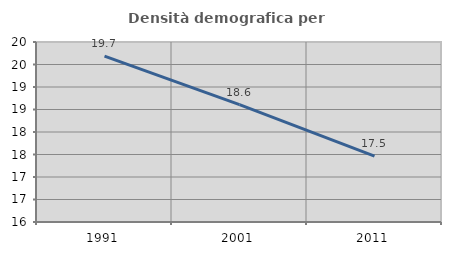
| Category | Densità demografica |
|---|---|
| 1991.0 | 19.684 |
| 2001.0 | 18.609 |
| 2011.0 | 17.464 |